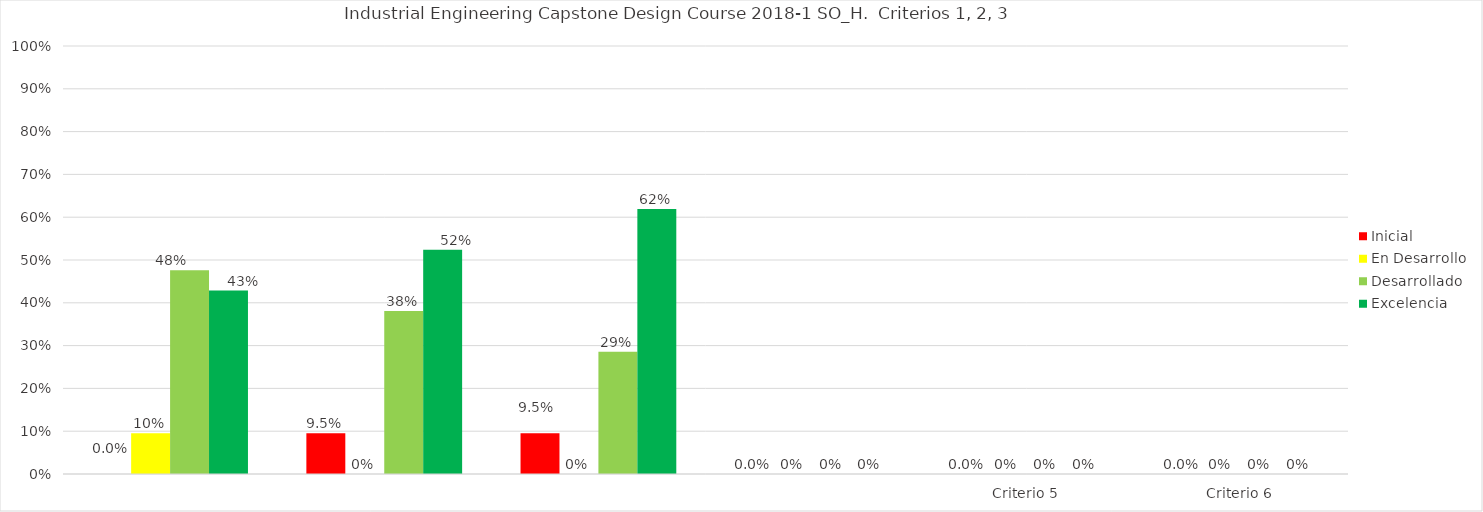
| Category | Inicial | En Desarrollo | Desarrollado | Excelencia |
|---|---|---|---|---|
|  | 0 | 0.095 | 0.476 | 0.429 |
|  | 0.095 | 0 | 0.381 | 0.524 |
|  | 0.095 | 0 | 0.286 | 0.619 |
|  | 0 | 0 | 0 | 0 |
| Criterio 5 | 0 | 0 | 0 | 0 |
| Criterio 6 | 0 | 0 | 0 | 0 |